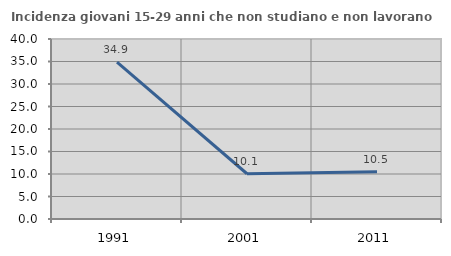
| Category | Incidenza giovani 15-29 anni che non studiano e non lavorano  |
|---|---|
| 1991.0 | 34.884 |
| 2001.0 | 10.056 |
| 2011.0 | 10.49 |